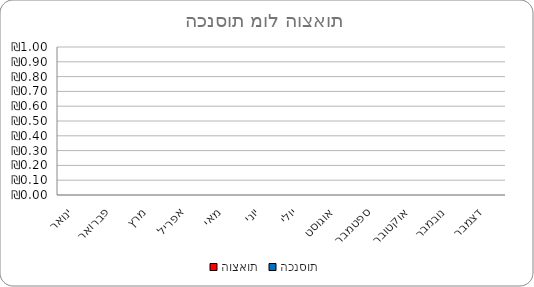
| Category | הוצאות | הכנסות |
|---|---|---|
| ינואר | 0 | 0 |
| פברואר | 0 | 0 |
| מרץ | 0 | 0 |
| אפריל | 0 | 0 |
| מאי | 0 | 0 |
| יוני | 0 | 0 |
| יולי | 0 | 0 |
| אוגוסט | 0 | 0 |
| ספטמבר | 0 | 0 |
| אוקטובר | 0 | 0 |
| נובמבר | 0 | 0 |
| דצמבר | 0 | 0 |